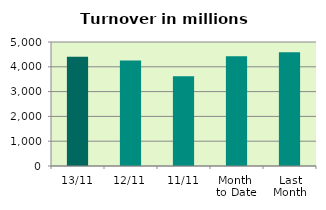
| Category | Series 0 |
|---|---|
| 13/11 | 4401.179 |
| 12/11 | 4249.947 |
| 11/11 | 3614.801 |
| Month 
to Date | 4423.351 |
| Last
Month | 4589.98 |